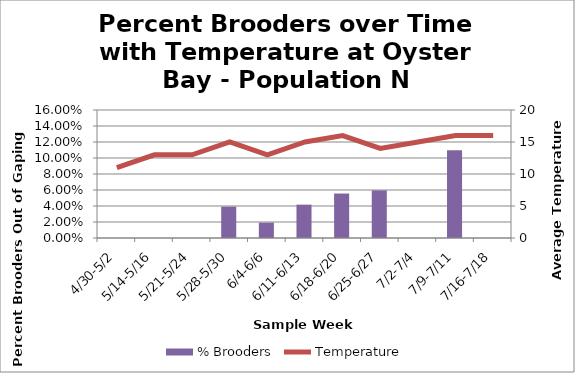
| Category | % Brooders |
|---|---|
| 4/30-5/2 | 0 |
| 5/14-5/16 | 0 |
| 5/21-5/24 | 0 |
| 5/28-5/30 | 0.039 |
| 6/4-6/6 | 0.019 |
| 6/11-6/13 | 0.042 |
| 6/18-6/20 | 0.056 |
| 6/25-6/27 | 0.06 |
| 7/2-7/4 | 0 |
| 7/9-7/11 | 0.11 |
| 7/16-7/18 | 0 |